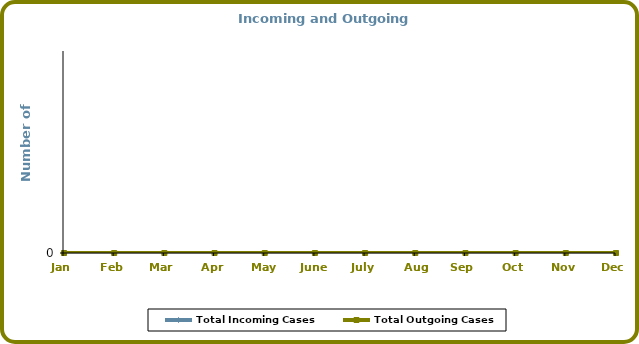
| Category | Total Incoming Cases | Total Outgoing Cases |
|---|---|---|
| Jan | 0 | 0 |
| Feb | 0 | 0 |
| Mar | 0 | 0 |
| Apr | 0 | 0 |
| May | 0 | 0 |
| June | 0 | 0 |
| July | 0 | 0 |
| Aug | 0 | 0 |
| Sep | 0 | 0 |
| Oct | 0 | 0 |
| Nov | 0 | 0 |
| Dec | 0 | 0 |